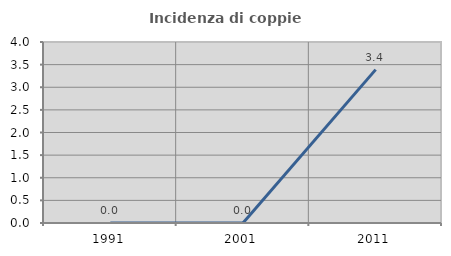
| Category | Incidenza di coppie miste |
|---|---|
| 1991.0 | 0 |
| 2001.0 | 0 |
| 2011.0 | 3.39 |